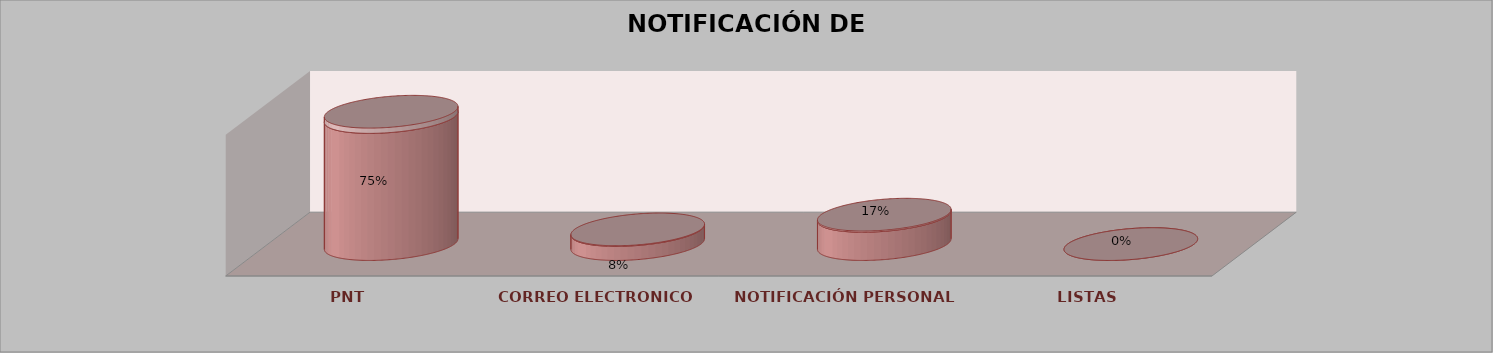
| Category | Series 0 | Series 1 | Series 2 | Series 3 | Series 4 |
|---|---|---|---|---|---|
| PNT |  |  |  | 18 | 0.75 |
| CORREO ELECTRONICO |  |  |  | 2 | 0.083 |
| NOTIFICACIÓN PERSONAL |  |  |  | 4 | 0.167 |
| LISTAS |  |  |  | 0 | 0 |